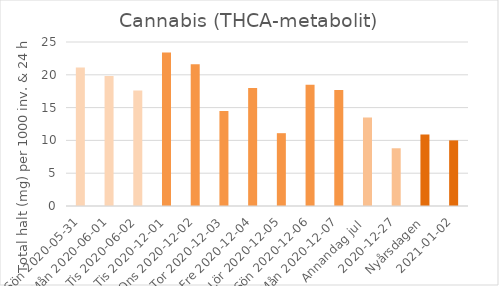
| Category | Cannabis (THCA-metabolit) |
|---|---|
| Sön 2020-05-31 | 21.1 |
| Mån 2020-06-01 | 19.8 |
|  Tis 2020-06-02 | 17.6 |
| Tis 2020-12-01 | 23.4 |
| Ons 2020-12-02 | 21.6 |
| Tor 2020-12-03 | 14.5 |
| Fre 2020-12-04 | 18 |
| Lör 2020-12-05 | 11.1 |
| Sön 2020-12-06 | 18.5 |
| Mån 2020-12-07 | 17.7 |
| Annandag jul  | 13.5 |
| 2020-12-27 | 8.8 |
| Nyårsdagen | 10.9 |
| 2021-01-02 | 10 |